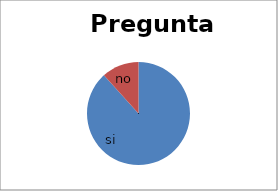
| Category | Series 0 |
|---|---|
| si | 324 |
| no | 43 |